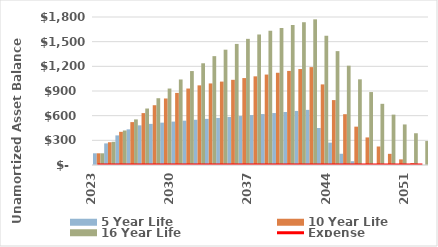
| Category | 5 Year Life | 10 Year Life | 16 Year Life |
|---|---|---|---|
| 2023.0 | 142.26 | 142.26 | 142.26 |
| 2024.0 | 262.63 | 276.856 | 282.191 |
| 2025.0 | 360.115 | 403.449 | 419.7 |
| 2026.0 | 433.672 | 521.685 | 554.689 |
| 2027.0 | 482.207 | 631.19 | 687.058 |
| 2028.0 | 500.057 | 727.057 | 812.181 |
| 2029.0 | 515.06 | 809.013 | 929.915 |
| 2030.0 | 527.902 | 876.78 | 1040.11 |
| 2031.0 | 539.32 | 930.075 | 1142.617 |
| 2032.0 | 550.107 | 968.607 | 1237.281 |
| 2033.0 | 561.109 | 992.082 | 1323.947 |
| 2034.0 | 572.331 | 1014.424 | 1402.453 |
| 2035.0 | 583.778 | 1035.983 | 1472.636 |
| 2036.0 | 595.453 | 1057.133 | 1534.331 |
| 2037.0 | 607.362 | 1078.276 | 1587.367 |
| 2038.0 | 619.509 | 1099.841 | 1631.571 |
| 2039.0 | 631.9 | 1121.838 | 1666.766 |
| 2040.0 | 644.538 | 1144.275 | 1701.665 |
| 2041.0 | 657.428 | 1167.161 | 1736.492 |
| 2042.0 | 670.577 | 1190.504 | 1771.491 |
| 2043.0 | 449.963 | 980.289 | 1572.895 |
| 2044.0 | 271.742 | 789.272 | 1384.955 |
| 2045.0 | 136.762 | 617.837 | 1207.882 |
| 2046.0 | 45.887 | 466.376 | 1041.894 |
| 2047.0 | 0 | 335.288 | 887.213 |
| 2048.0 | 0 | 224.982 | 744.065 |
| 2049.0 | 0 | 135.871 | 612.68 |
| 2050.0 | 0 | 68.381 | 493.295 |
| 2051.0 | 0 | 22.944 | 386.148 |
| 2052.0 | 0 | 0 | 291.485 |